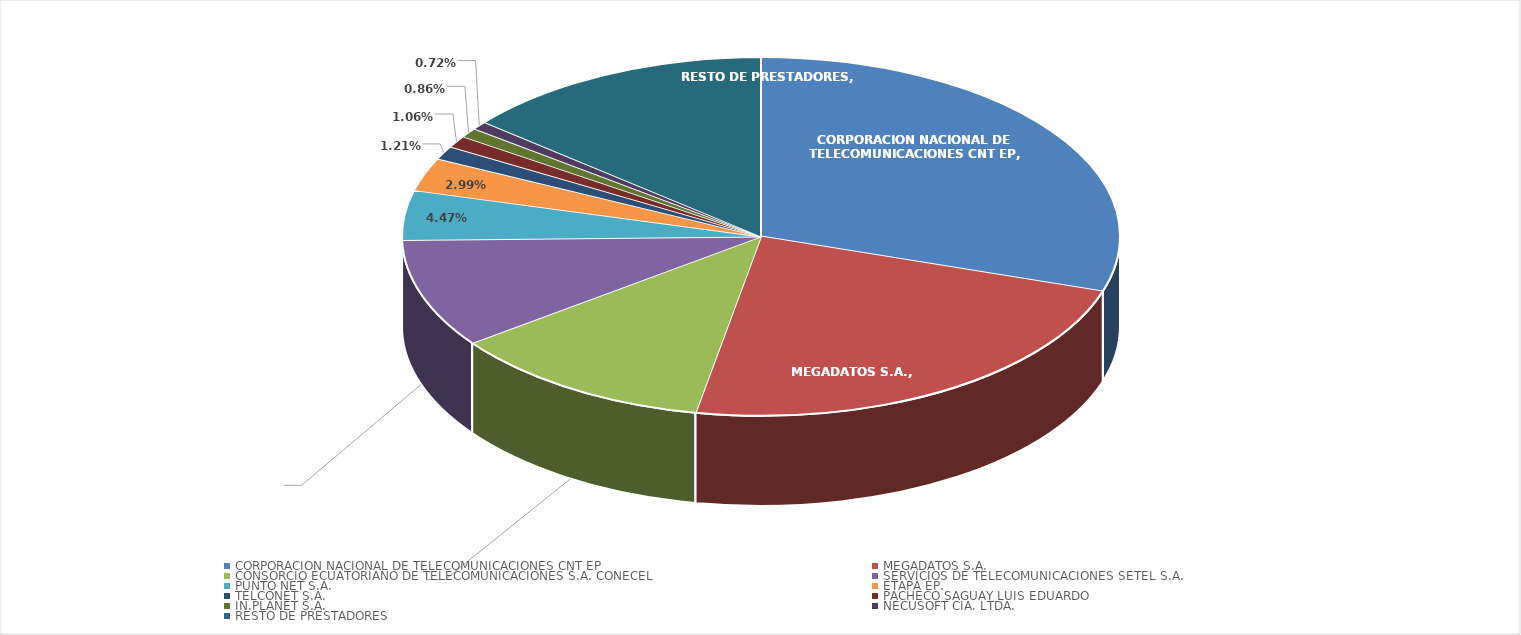
| Category | Series 0 |
|---|---|
| CORPORACION NACIONAL DE TELECOMUNICACIONES CNT EP | 0.3 |
| MEGADATOS S.A. | 0.23 |
| CONSORCIO ECUATORIANO DE TELECOMUNICACIONES S.A. CONECEL | 0.12 |
| SERVICIOS DE TELECOMUNICACIONES SETEL S.A. | 0.098 |
| PUNTO NET S.A. | 0.045 |
| ETAPA EP. | 0.03 |
| TELCONET S.A. | 0.012 |
| PACHECO SAGUAY LUIS EDUARDO | 0.011 |
| IN.PLANET S.A. | 0.009 |
| NECUSOFT CIA. LTDA. | 0.007 |
| RESTO DE PRESTADORES | 0.14 |